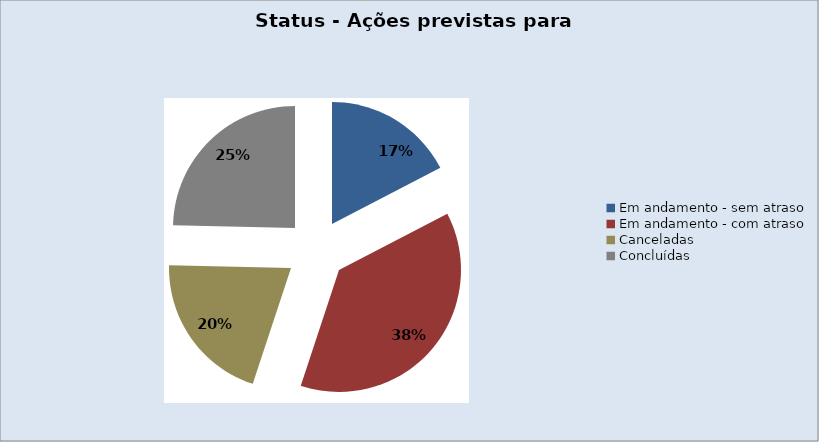
| Category | Series 0 |
|---|---|
| Em andamento - sem atraso | 12 |
| Em andamento - com atraso | 26 |
| Canceladas | 14 |
| Concluídas | 17 |